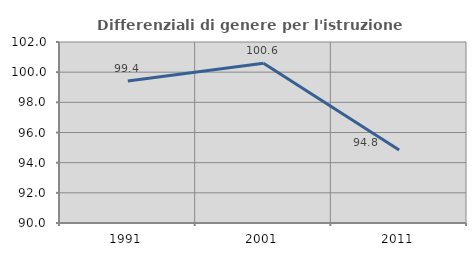
| Category | Differenziali di genere per l'istruzione superiore |
|---|---|
| 1991.0 | 99.407 |
| 2001.0 | 100.587 |
| 2011.0 | 94.842 |